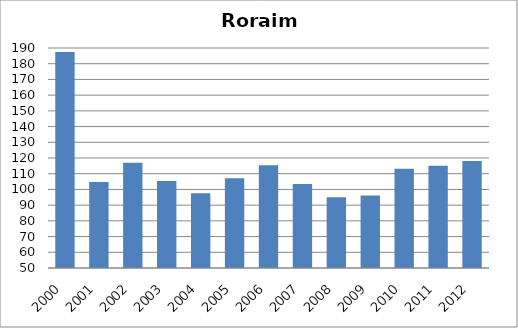
| Category | BCG |
|---|---|
| 2000.0 | 187.41 |
| 2001.0 | 104.68 |
| 2002.0 | 116.91 |
| 2003.0 | 105.42 |
| 2004.0 | 97.5 |
| 2005.0 | 107.16 |
| 2006.0 | 115.45 |
| 2007.0 | 103.53 |
| 2008.0 | 95.06 |
| 2009.0 | 96.09 |
| 2010.0 | 113.21 |
| 2011.0 | 115.06 |
| 2012.0 | 118.08 |